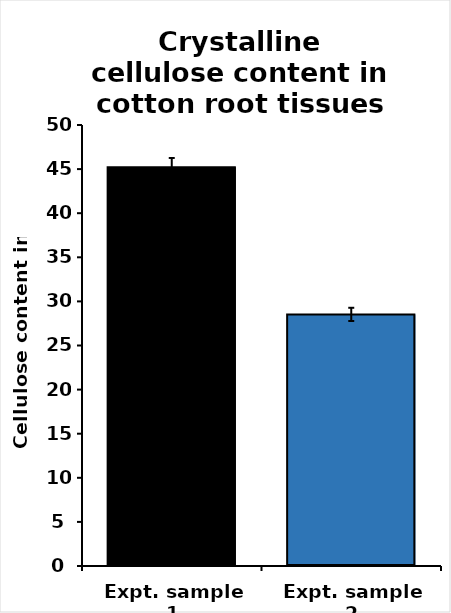
| Category | Series 0 |
|---|---|
| Expt. sample 1 | 45.201 |
| Expt. sample 2 | 28.528 |